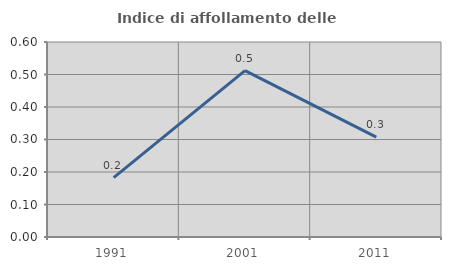
| Category | Indice di affollamento delle abitazioni  |
|---|---|
| 1991.0 | 0.183 |
| 2001.0 | 0.512 |
| 2011.0 | 0.307 |